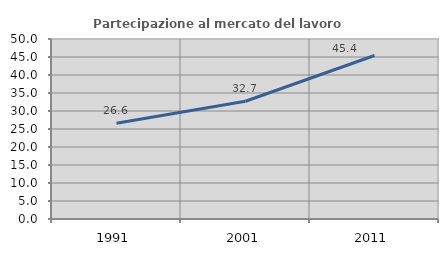
| Category | Partecipazione al mercato del lavoro  femminile |
|---|---|
| 1991.0 | 26.606 |
| 2001.0 | 32.701 |
| 2011.0 | 45.413 |